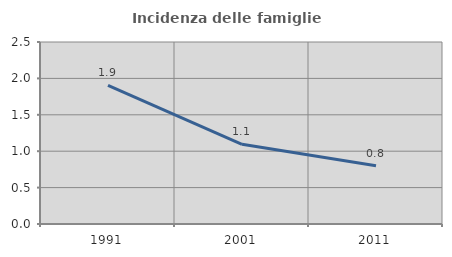
| Category | Incidenza delle famiglie numerose |
|---|---|
| 1991.0 | 1.905 |
| 2001.0 | 1.094 |
| 2011.0 | 0.799 |